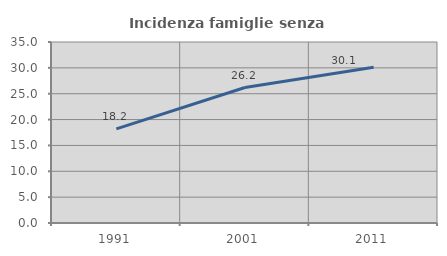
| Category | Incidenza famiglie senza nuclei |
|---|---|
| 1991.0 | 18.205 |
| 2001.0 | 26.196 |
| 2011.0 | 30.127 |